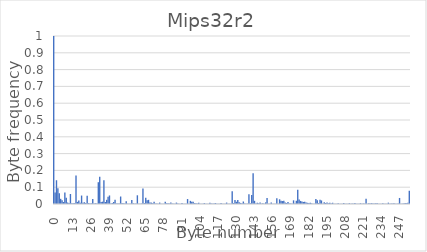
| Category | Series 0 |
|---|---|
| 0.0 | 1 |
| 1.0 | 0.069 |
| 2.0 | 0.141 |
| 3.0 | 0.094 |
| 4.0 | 0.065 |
| 5.0 | 0.031 |
| 6.0 | 0.022 |
| 7.0 | 0.012 |
| 8.0 | 0.068 |
| 9.0 | 0.037 |
| 10.0 | 0.009 |
| 11.0 | 0.006 |
| 12.0 | 0.059 |
| 13.0 | 0.004 |
| 14.0 | 0.004 |
| 15.0 | 0.005 |
| 16.0 | 0.17 |
| 17.0 | 0.012 |
| 18.0 | 0.02 |
| 19.0 | 0.008 |
| 20.0 | 0.05 |
| 21.0 | 0.007 |
| 22.0 | 0.011 |
| 23.0 | 0.006 |
| 24.0 | 0.05 |
| 25.0 | 0.005 |
| 26.0 | 0.004 |
| 27.0 | 0.004 |
| 28.0 | 0.029 |
| 29.0 | 0.003 |
| 30.0 | 0.005 |
| 31.0 | 0.004 |
| 32.0 | 0.13 |
| 33.0 | 0.163 |
| 34.0 | 0.012 |
| 35.0 | 0.014 |
| 36.0 | 0.142 |
| 37.0 | 0.012 |
| 38.0 | 0.025 |
| 39.0 | 0.044 |
| 40.0 | 0.051 |
| 41.0 | 0.003 |
| 42.0 | 0.006 |
| 43.0 | 0.012 |
| 44.0 | 0.025 |
| 45.0 | 0.003 |
| 46.0 | 0.003 |
| 47.0 | 0.002 |
| 48.0 | 0.045 |
| 49.0 | 0.006 |
| 50.0 | 0.004 |
| 51.0 | 0.002 |
| 52.0 | 0.016 |
| 53.0 | 0.002 |
| 54.0 | 0.002 |
| 55.0 | 0.002 |
| 56.0 | 0.024 |
| 57.0 | 0.005 |
| 58.0 | 0.002 |
| 59.0 | 0.002 |
| 60.0 | 0.052 |
| 61.0 | 0.001 |
| 62.0 | 0.002 |
| 63.0 | 0.003 |
| 64.0 | 0.092 |
| 65.0 | 0.005 |
| 66.0 | 0.038 |
| 67.0 | 0.023 |
| 68.0 | 0.025 |
| 69.0 | 0.009 |
| 70.0 | 0.008 |
| 71.0 | 0.005 |
| 72.0 | 0.013 |
| 73.0 | 0.003 |
| 74.0 | 0.002 |
| 75.0 | 0.002 |
| 76.0 | 0.008 |
| 77.0 | 0.001 |
| 78.0 | 0.001 |
| 79.0 | 0.001 |
| 80.0 | 0.013 |
| 81.0 | 0.004 |
| 82.0 | 0.005 |
| 83.0 | 0.003 |
| 84.0 | 0.009 |
| 85.0 | 0.002 |
| 86.0 | 0.002 |
| 87.0 | 0.002 |
| 88.0 | 0.008 |
| 89.0 | 0.003 |
| 90.0 | 0.001 |
| 91.0 | 0.001 |
| 92.0 | 0.006 |
| 93.0 | 0.001 |
| 94.0 | 0.002 |
| 95.0 | 0.001 |
| 96.0 | 0.03 |
| 97.0 | 0.001 |
| 98.0 | 0.019 |
| 99.0 | 0.014 |
| 100.0 | 0.013 |
| 101.0 | 0.005 |
| 102.0 | 0.004 |
| 103.0 | 0.003 |
| 104.0 | 0.007 |
| 105.0 | 0.002 |
| 106.0 | 0.001 |
| 107.0 | 0.001 |
| 108.0 | 0.005 |
| 109.0 | 0.001 |
| 110.0 | 0.002 |
| 111.0 | 0.001 |
| 112.0 | 0.008 |
| 113.0 | 0.002 |
| 114.0 | 0.002 |
| 115.0 | 0.003 |
| 116.0 | 0.006 |
| 117.0 | 0.002 |
| 118.0 | 0.002 |
| 119.0 | 0.001 |
| 120.0 | 0.006 |
| 121.0 | 0.001 |
| 122.0 | 0.001 |
| 123.0 | 0.001 |
| 124.0 | 0.008 |
| 125.0 | 0.001 |
| 126.0 | 0.002 |
| 127.0 | 0.001 |
| 128.0 | 0.076 |
| 129.0 | 0.006 |
| 130.0 | 0.024 |
| 131.0 | 0.013 |
| 132.0 | 0.024 |
| 133.0 | 0.01 |
| 134.0 | 0.006 |
| 135.0 | 0.005 |
| 136.0 | 0.015 |
| 137.0 | 0.002 |
| 138.0 | 0.002 |
| 139.0 | 0.002 |
| 140.0 | 0.058 |
| 141.0 | 0.004 |
| 142.0 | 0.053 |
| 143.0 | 0.183 |
| 144.0 | 0.019 |
| 145.0 | 0.003 |
| 146.0 | 0.007 |
| 147.0 | 0.004 |
| 148.0 | 0.009 |
| 149.0 | 0.002 |
| 150.0 | 0.004 |
| 151.0 | 0.002 |
| 152.0 | 0.01 |
| 153.0 | 0.035 |
| 154.0 | 0.002 |
| 155.0 | 0.001 |
| 156.0 | 0.009 |
| 157.0 | 0.001 |
| 158.0 | 0.002 |
| 159.0 | 0.001 |
| 160.0 | 0.034 |
| 161.0 | 0.002 |
| 162.0 | 0.028 |
| 163.0 | 0.02 |
| 164.0 | 0.018 |
| 165.0 | 0.019 |
| 166.0 | 0.008 |
| 167.0 | 0.006 |
| 168.0 | 0.012 |
| 169.0 | 0.003 |
| 170.0 | 0.003 |
| 171.0 | 0.002 |
| 172.0 | 0.022 |
| 173.0 | 0.003 |
| 174.0 | 0.019 |
| 175.0 | 0.085 |
| 176.0 | 0.027 |
| 177.0 | 0.018 |
| 178.0 | 0.015 |
| 179.0 | 0.012 |
| 180.0 | 0.013 |
| 181.0 | 0.009 |
| 182.0 | 0.007 |
| 183.0 | 0.006 |
| 184.0 | 0.008 |
| 185.0 | 0.003 |
| 186.0 | 0.001 |
| 187.0 | 0.001 |
| 188.0 | 0.03 |
| 189.0 | 0.022 |
| 190.0 | 0.006 |
| 191.0 | 0.025 |
| 192.0 | 0.021 |
| 193.0 | 0.001 |
| 194.0 | 0.011 |
| 195.0 | 0.006 |
| 196.0 | 0.008 |
| 197.0 | 0.004 |
| 198.0 | 0.007 |
| 199.0 | 0.003 |
| 200.0 | 0.007 |
| 201.0 | 0.002 |
| 202.0 | 0.001 |
| 203.0 | 0.001 |
| 204.0 | 0.004 |
| 205.0 | 0.001 |
| 206.0 | 0.001 |
| 207.0 | 0.001 |
| 208.0 | 0.006 |
| 209.0 | 0.002 |
| 210.0 | 0.002 |
| 211.0 | 0.002 |
| 212.0 | 0.005 |
| 213.0 | 0.002 |
| 214.0 | 0.003 |
| 215.0 | 0.002 |
| 216.0 | 0.006 |
| 217.0 | 0.001 |
| 218.0 | 0.001 |
| 219.0 | 0.001 |
| 220.0 | 0.005 |
| 221.0 | 0.001 |
| 222.0 | 0.002 |
| 223.0 | 0.002 |
| 224.0 | 0.032 |
| 225.0 | 0.001 |
| 226.0 | 0.005 |
| 227.0 | 0.003 |
| 228.0 | 0.005 |
| 229.0 | 0.002 |
| 230.0 | 0.003 |
| 231.0 | 0.004 |
| 232.0 | 0.005 |
| 233.0 | 0.001 |
| 234.0 | 0.002 |
| 235.0 | 0.001 |
| 236.0 | 0.004 |
| 237.0 | 0.001 |
| 238.0 | 0.002 |
| 239.0 | 0.002 |
| 240.0 | 0.008 |
| 241.0 | 0.002 |
| 242.0 | 0.002 |
| 243.0 | 0.002 |
| 244.0 | 0.005 |
| 245.0 | 0.002 |
| 246.0 | 0.002 |
| 247.0 | 0.003 |
| 248.0 | 0.036 |
| 249.0 | 0.002 |
| 250.0 | 0.002 |
| 251.0 | 0.002 |
| 252.0 | 0.006 |
| 253.0 | 0.004 |
| 254.0 | 0.007 |
| 255.0 | 0.079 |